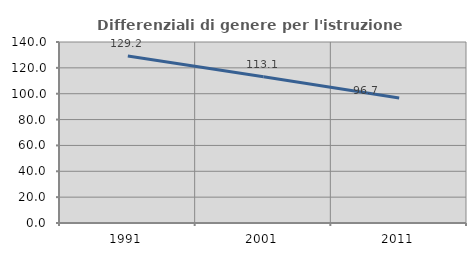
| Category | Differenziali di genere per l'istruzione superiore |
|---|---|
| 1991.0 | 129.24 |
| 2001.0 | 113.143 |
| 2011.0 | 96.743 |